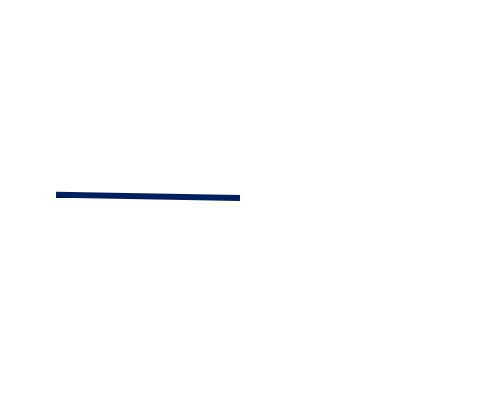
| Category | Series 0 |
|---|---|
| Nadelstand | 0 |
| Nadeldicke | 0.005 |
| Leer | 1.8 |